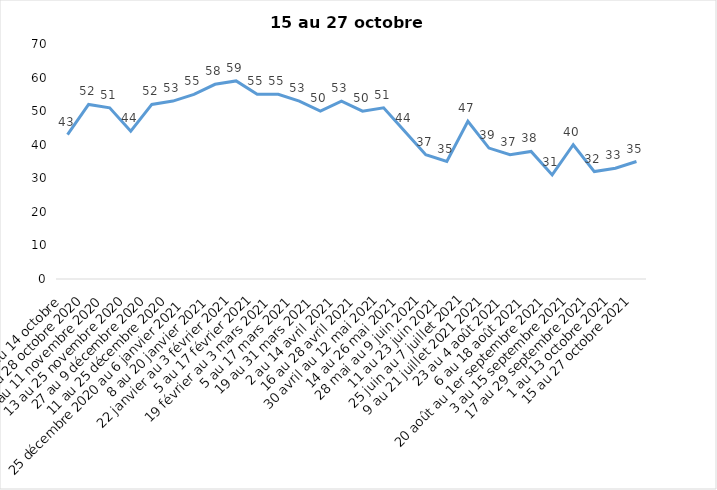
| Category | Toujours aux trois mesures |
|---|---|
| 2 au 14 octobre  | 43 |
| 16 au 28 octobre 2020 | 52 |
| 30 octobre au 11 novembre 2020 | 51 |
| 13 au 25 novembre 2020 | 44 |
| 27 au 9 décembre 2020 | 52 |
| 11 au 25 décembre 2020 | 53 |
| 25 décembre 2020 au 6 janvier 2021 | 55 |
| 8 au 20 janvier 2021 | 58 |
| 22 janvier au 3 février 2021 | 59 |
| 5 au 17 février 2021 | 55 |
| 19 février au 3 mars 2021 | 55 |
| 5 au 17 mars 2021 | 53 |
| 19 au 31 mars 2021 | 50 |
| 2 au 14 avril 2021 | 53 |
| 16 au 28 avril 2021 | 50 |
| 30 avril au 12 mai 2021 | 51 |
| 14 au 26 mai 2021 | 44 |
| 28 mai au 9 juin 2021 | 37 |
| 11 au 23 juin 2021 | 35 |
| 25 juin au 7 juillet 2021 | 47 |
| 9 au 21 juillet 2021 2021 | 39 |
| 23 au 4 août 2021 | 37 |
| 6 au 18 août 2021 | 38 |
| 20 août au 1er septembre 2021 | 31 |
| 3 au 15 septembre 2021 | 40 |
| 17 au 29 septembre 2021 | 32 |
| 1 au 13 octobre 2021 | 33 |
| 15 au 27 octobre 2021 | 35 |